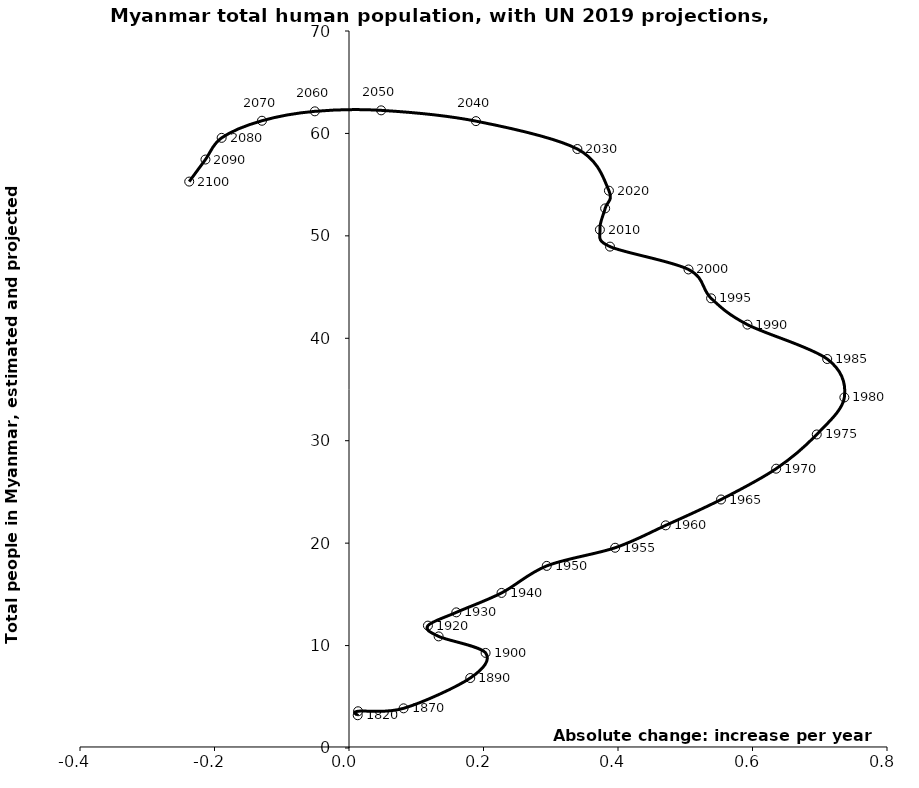
| Category | Series 0 |
|---|---|
| 0.012955188711001646 | 3.199 |
| 0.013484344306239748 | 3.587 |
| 0.08112958845956489 | 3.873 |
| 0.18030824851532573 | 6.832 |
| 0.20313188496510684 | 9.282 |
| 0.1332924697660099 | 10.895 |
| 0.11737218504720862 | 11.948 |
| 0.1595677820812808 | 13.243 |
| 0.22685265302750413 | 15.139 |
| 0.2940497968527637 | 17.78 |
| 0.3957313999999997 | 19.55 |
| 0.4709288000000004 | 21.737 |
| 0.5532127000000007 | 24.259 |
| 0.6351735999999996 | 27.269 |
| 0.6955243999999994 | 30.611 |
| 0.7365991000000036 | 34.224 |
| 0.7110885999999994 | 37.977 |
| 0.5924511999999964 | 41.335 |
| 0.5384501999999983 | 43.902 |
| 0.5048326000000024 | 46.72 |
| 0.38811170000000034 | 48.95 |
| 0.37308019999999475 | 50.601 |
| 0.38089820000000285 | 52.681 |
| 0.3865178666666675 | 54.41 |
| 0.33959019999999923 | 58.478 |
| 0.1887468000000016 | 61.202 |
| 0.04778264999999919 | 62.253 |
| -0.05078550000000028 | 62.157 |
| -0.12944384999999983 | 61.238 |
| -0.18935985000000138 | 59.568 |
| -0.21347220000000106 | 57.451 |
| -0.23758455000000073 | 55.299 |